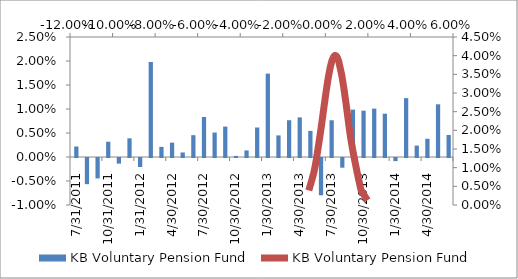
| Category | KB Voluntary Pension Fund |
|---|---|
| 31/07/2011 | 0.002 |
| 31/08/2011 | -0.005 |
| 30/09/2011 | -0.004 |
| 31/10/2011 | 0.003 |
| 30/11/2011 | -0.001 |
| 31/12/2011 | 0.004 |
| 31/01/2012 | -0.002 |
| 29/02/2012 | 0.02 |
| 31/03/2012 | 0.002 |
| 30/04/2012 | 0.003 |
| 31/05/2012 | 0.001 |
| 30/06/2012 | 0.005 |
| 31/07/2012 | 0.008 |
| 31/08/2012 | 0.005 |
| 30/09/2012 | 0.006 |
| 31/10/2012 | 0 |
| 30/11/2012 | 0.001 |
| 31/12/2012 | 0.006 |
| 31/01/2013 | 0.017 |
| 28/02/2013 | 0.004 |
| 31/03/2013 | 0.008 |
| 30/04/2013 | 0.008 |
| 31/05/2013 | 0.005 |
| 30/06/2013 | -0.008 |
| 31/07/2013 | 0.008 |
| 31/08/2013 | -0.002 |
| 30/09/2013 | 0.01 |
| 31/10/2013 | 0.01 |
| 30/11/2013 | 0.01 |
| 31/12/2013 | 0.009 |
| 31/01/2014 | -0.001 |
| 28/02/2014 | 0.012 |
| 31/03/2014 | 0.002 |
| 30/04/2014 | 0.004 |
| 31/05/2014 | 0.011 |
| 30/06/2014 | 0.005 |